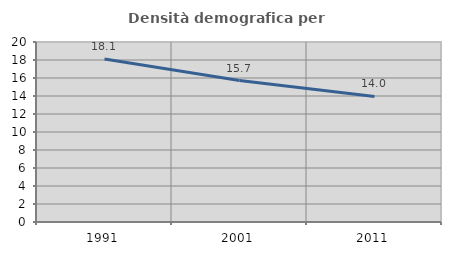
| Category | Densità demografica |
|---|---|
| 1991.0 | 18.101 |
| 2001.0 | 15.722 |
| 2011.0 | 13.951 |